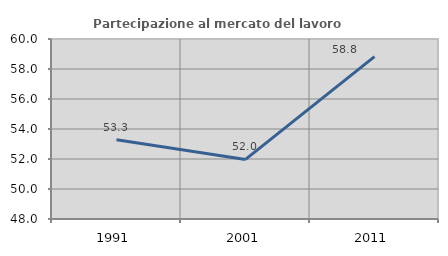
| Category | Partecipazione al mercato del lavoro  femminile |
|---|---|
| 1991.0 | 53.289 |
| 2001.0 | 51.974 |
| 2011.0 | 58.824 |